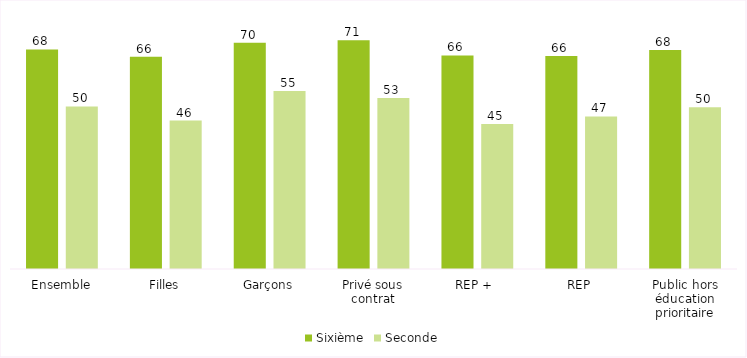
| Category | Sixième | Seconde |
|---|---|---|
| Ensemble | 67.8 | 50.2 |
| Filles | 65.536 | 45.853 |
| Garçons | 69.9 | 54.982 |
| Privé sous contrat | 70.649 | 52.853 |
| REP +  | 65.96 | 44.777 |
| REP | 65.766 | 47.106 |
| Public hors éducation prioritaire | 67.674 | 49.957 |